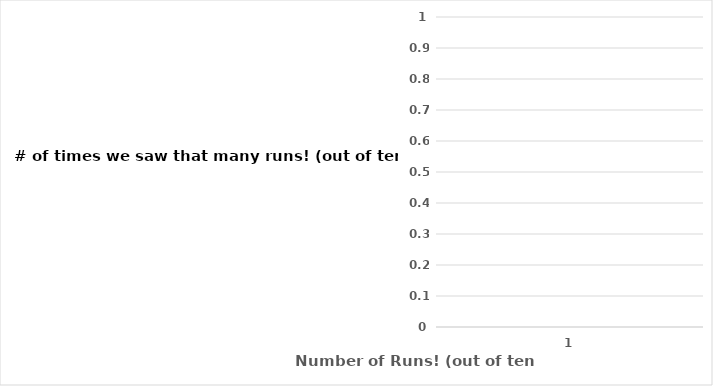
| Category | heads |
|---|---|
| 1.0 | 0 |
| 2.0 | 0 |
| 3.0 | 0 |
| 4.0 | 1 |
| 5.0 | 3 |
| 6.0 | 0 |
| 7.0 | 0 |
| 8.0 | 0 |
| 9.0 | 0 |
| 10.0 | 0 |